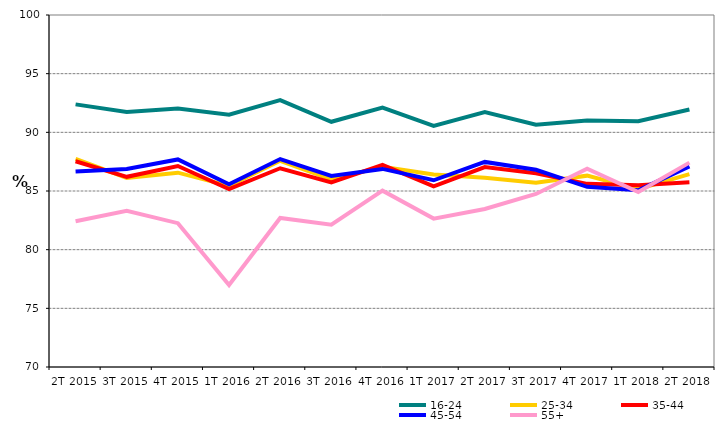
| Category | 16-24 | 25-34 | 35-44 | 45-54 | 55+ |
|---|---|---|---|---|---|
| 2T 2015 | 92.384 | 87.745 | 87.535 | 86.665 | 82.427 |
| 3T 2015 | 91.733 | 86.114 | 86.208 | 86.884 | 83.314 |
| 4T 2015 | 92.021 | 86.562 | 87.132 | 87.69 | 82.258 |
| 1T 2016 | 91.498 | 85.428 | 85.156 | 85.569 | 76.982 |
| 2T 2016 | 92.744 | 87.575 | 86.939 | 87.722 | 82.7 |
| 3T 2016 | 90.898 | 85.992 | 85.739 | 86.285 | 82.133 |
| 4T 2016 | 92.116 | 87.06 | 87.218 | 86.882 | 85.029 |
| 1T 2017 | 90.554 | 86.398 | 85.403 | 85.914 | 82.648 |
| 2T 2017 | 91.719 | 86.139 | 87.045 | 87.48 | 83.47 |
| 3T 2017 | 90.642 | 85.694 | 86.515 | 86.812 | 84.749 |
| 4T 2017 | 90.998 | 86.308 | 85.608 | 85.357 | 86.901 |
| 1T 2018 | 90.942 | 85.161 | 85.489 | 85.057 | 84.908 |
| 2T 2018 | 91.95 | 86.442 | 85.754 | 87.094 | 87.419 |